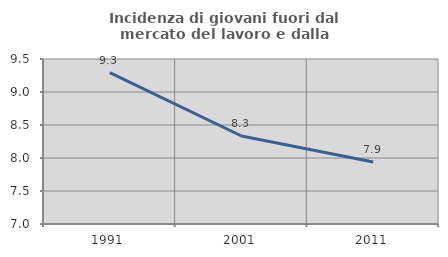
| Category | Incidenza di giovani fuori dal mercato del lavoro e dalla formazione  |
|---|---|
| 1991.0 | 9.294 |
| 2001.0 | 8.333 |
| 2011.0 | 7.94 |